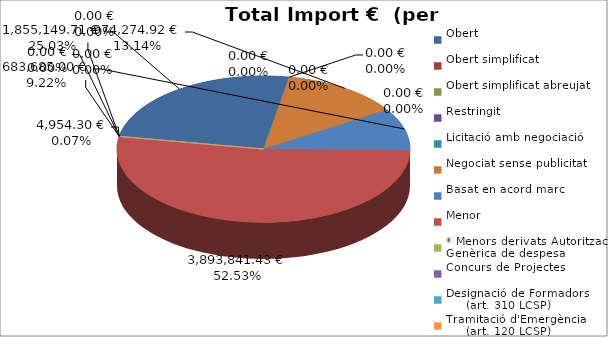
| Category | Total preu
(amb IVA) |
|---|---|
| Obert | 1855149.71 |
| Obert simplificat | 0 |
| Obert simplificat abreujat | 0 |
| Restringit | 0 |
| Licitació amb negociació | 0 |
| Negociat sense publicitat | 974274.92 |
| Basat en acord marc | 683685 |
| Menor | 3893841.43 |
| * Menors derivats Autorització Genèrica de despesa | 4954.3 |
| Concurs de Projectes | 0 |
| Designació de Formadors
     (art. 310 LCSP) | 0 |
| Tramitació d'Emergència
     (art. 120 LCSP) | 0 |